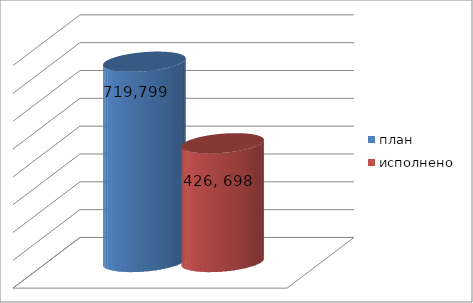
| Category | план | исполнено |
|---|---|---|
| 0 | 719799554.33 | 426698988.01 |